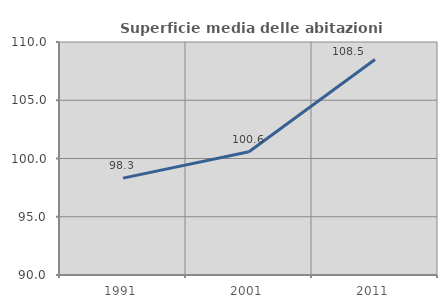
| Category | Superficie media delle abitazioni occupate |
|---|---|
| 1991.0 | 98.318 |
| 2001.0 | 100.577 |
| 2011.0 | 108.503 |